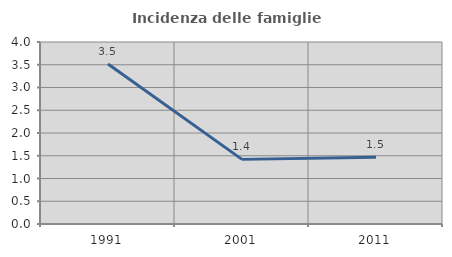
| Category | Incidenza delle famiglie numerose |
|---|---|
| 1991.0 | 3.517 |
| 2001.0 | 1.42 |
| 2011.0 | 1.465 |